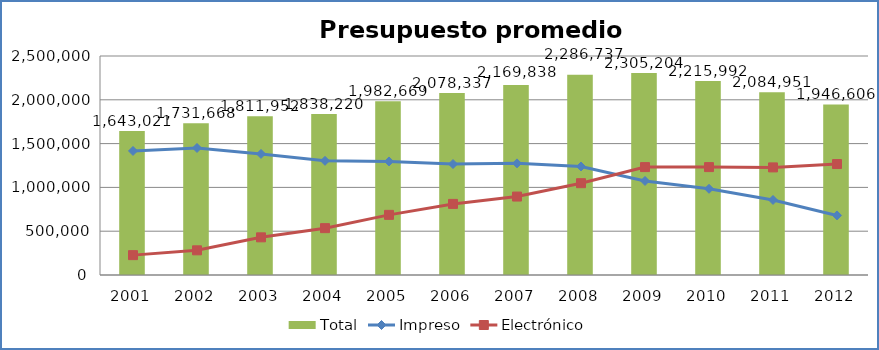
| Category | Total |
|---|---|
| 2001 | 1643021 |
| 2002 | 1731668 |
| 2003 | 1811952 |
| 2004 | 1838220 |
| 2005 | 1982669 |
| 2006 | 2078337 |
| 2007 | 2169838 |
| 2008 | 2286737 |
| 2009 | 2305204 |
| 2010 | 2215992 |
| 2011 | 2084951 |
| 2012 | 1946606 |